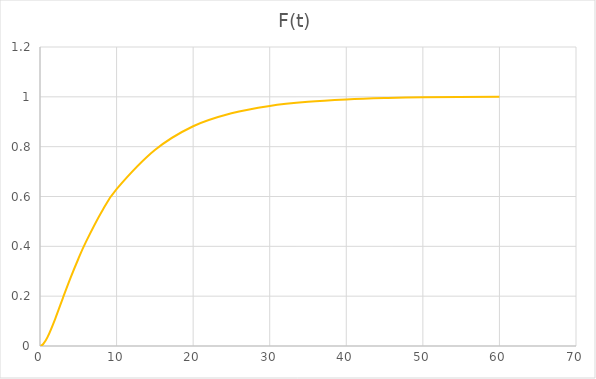
| Category | F(t) |
|---|---|
| 0.0 | 0 |
| 0.4 | 0.007 |
| 1.0 | 0.037 |
| 2.0 | 0.11 |
| 3.0 | 0.194 |
| 4.0 | 0.274 |
| 5.0 | 0.349 |
| 6.0 | 0.418 |
| 8.0 | 0.536 |
| 10.0 | 0.629 |
| 15.0 | 0.786 |
| 20.0 | 0.882 |
| 25.0 | 0.934 |
| 30.0 | 0.964 |
| 35.0 | 0.98 |
| 40.0 | 0.99 |
| 45.0 | 0.995 |
| 50.0 | 0.998 |
| 60.0 | 1 |